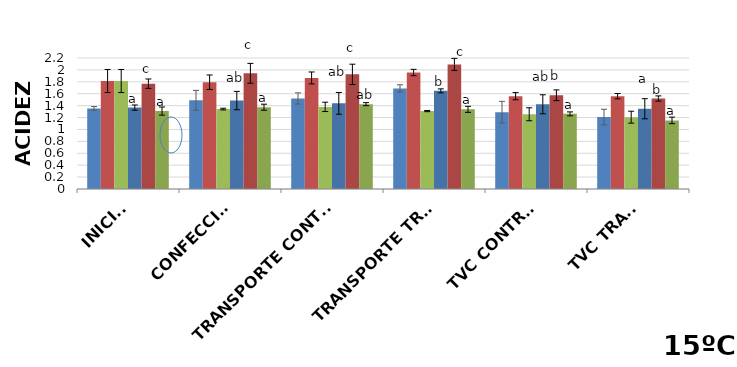
| Category | Black Splendor | Showtime | Black Gold |
|---|---|---|---|
| INICIAL | 1.367 | 1.769 | 1.309 |
| CONFECCIÓN | 1.485 | 1.943 | 1.374 |
|  TRANSPORTE CONTROL | 1.438 | 1.925 | 1.425 |
| TRANSPORTE TRAT. | 1.648 | 2.093 | 1.338 |
| TVC CONTROL | 1.423 | 1.575 | 1.262 |
| TVC TRAT. | 1.348 | 1.52 | 1.152 |